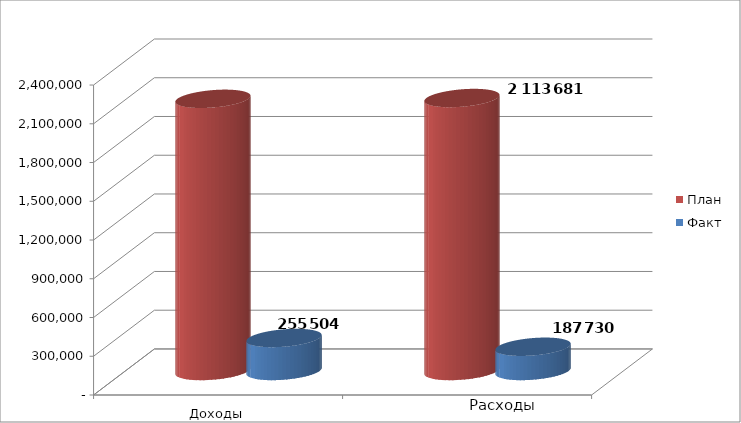
| Category | План | Факт |
|---|---|---|
| 0 | 2107527 | 255504 |
| 1 | 2113681 | 187730 |